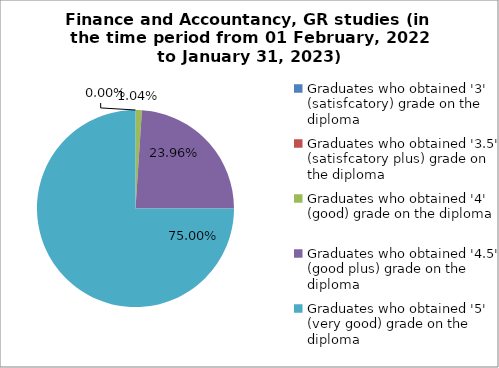
| Category | Series 1 |
|---|---|
| Graduates who obtained '3' (satisfcatory) grade on the diploma  | 0 |
| Graduates who obtained '3.5' (satisfcatory plus) grade on the diploma  | 0 |
| Graduates who obtained '4' (good) grade on the diploma  | 1.042 |
| Graduates who obtained '4.5' (good plus) grade on the diploma  | 23.958 |
| Graduates who obtained '5' (very good) grade on the diploma  | 75 |